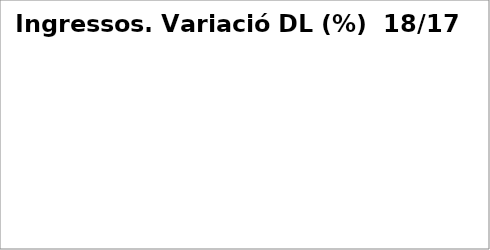
| Category | Series 0 |
|---|---|
| Impostos directes | -0.11 |
| Impostos indirectes | -0.002 |
| Taxes, preus públics i altres ingressos | 0.162 |
| Transferències corrents | 0.063 |
| Ingressos patrimonials | -0.087 |
| Venda d'inversions reals | -0.776 |
| Transferències de capital | -0.135 |
| Actius financers* | 0 |
| Passius financers | 0.322 |